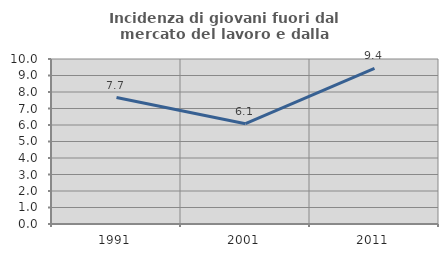
| Category | Incidenza di giovani fuori dal mercato del lavoro e dalla formazione  |
|---|---|
| 1991.0 | 7.665 |
| 2001.0 | 6.078 |
| 2011.0 | 9.432 |